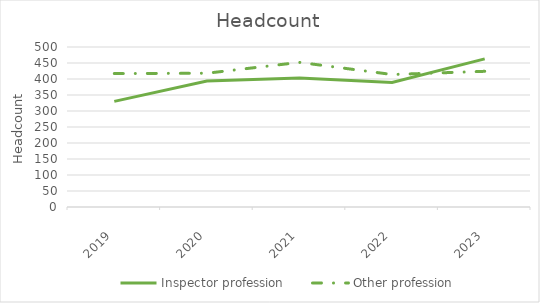
| Category | Inspector profession | Other profession |
|---|---|---|
| 2019.0 | 330 | 417 |
| 2020.0 | 394 | 418 |
| 2021.0 | 403 | 452 |
| 2022.0 | 389 | 414 |
| 2023.0 | 463 | 424 |